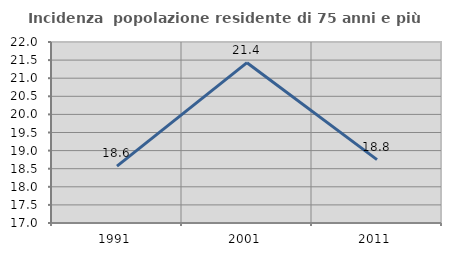
| Category | Incidenza  popolazione residente di 75 anni e più |
|---|---|
| 1991.0 | 18.571 |
| 2001.0 | 21.429 |
| 2011.0 | 18.75 |